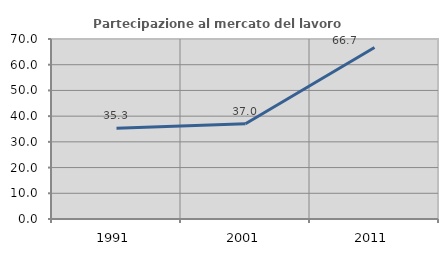
| Category | Partecipazione al mercato del lavoro  femminile |
|---|---|
| 1991.0 | 35.294 |
| 2001.0 | 37.037 |
| 2011.0 | 66.667 |